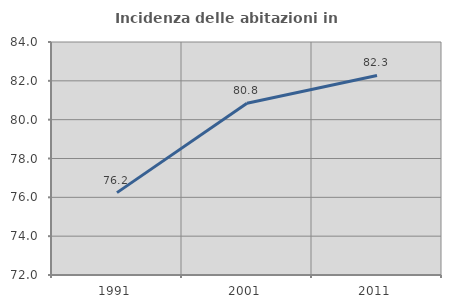
| Category | Incidenza delle abitazioni in proprietà  |
|---|---|
| 1991.0 | 76.243 |
| 2001.0 | 80.845 |
| 2011.0 | 82.278 |